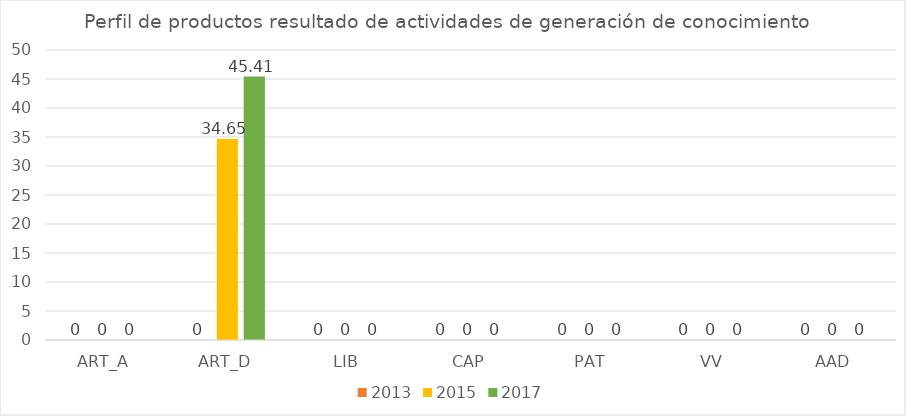
| Category | 2013 | 2015 | 2017 |
|---|---|---|---|
| ART_A | 0 | 0 | 0 |
| ART_D | 0 | 34.65 | 45.41 |
| LIB | 0 | 0 | 0 |
| CAP | 0 | 0 | 0 |
| PAT | 0 | 0 | 0 |
| VV | 0 | 0 | 0 |
| AAD | 0 | 0 | 0 |